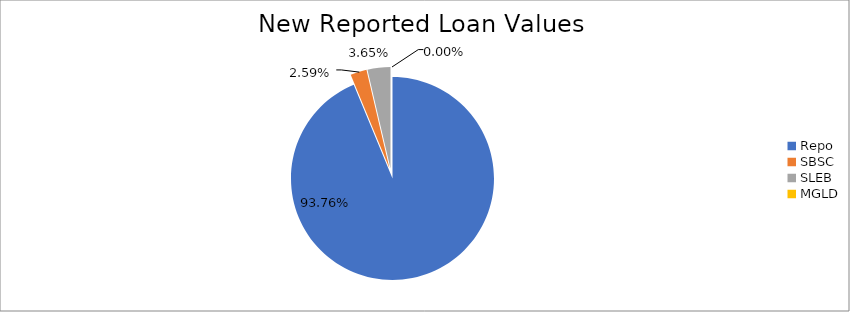
| Category | Series 0 |
|---|---|
| Repo | 9067816.839 |
| SBSC | 250756.905 |
| SLEB | 352648.84 |
| MGLD | 7.879 |